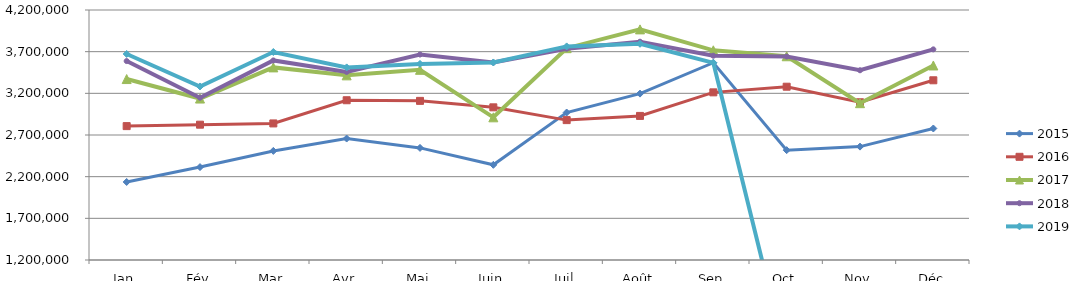
| Category | 2015 | 2016 | 2017 | 2018 | 2019 |
|---|---|---|---|---|---|
| Jan | 2136502.342 | 2806589.776 | 3371394.712 | 3587233.956 | 3672518.421 |
| Fév | 2315053.514 | 2823756.288 | 3137330.791 | 3147030.186 | 3282543.846 |
| Mar | 2509043.11 | 2838870.504 | 3511145.885 | 3594630.489 | 3695934.705 |
| Avr | 2657589.53 | 3117177.085 | 3415732.63 | 3456756.804 | 3511049.816 |
| Mai | 2545128.164 | 3109551.865 | 3482213.067 | 3665518.998 | 3553093.664 |
| Juin | 2342028.041 | 3032032.74 | 2912135.998 | 3570082.41 | 3570224.807 |
| Juil | 2969663.081 | 2878621.442 | 3741770.069 | 3735197.664 | 3762976.089 |
| Août | 3196553.523 | 2928941.165 | 3967466.719 | 3819459.479 | 3794659.092 |
| Sep | 3567173.843 | 3211689.699 | 3716298.608 | 3651284.946 | 3566098.404 |
| Oct | 2518251.995 | 3279542.566 | 3644824.355 | 3642052.865 | 0 |
| Nov | 2560629.68 | 3092952.422 | 3081786.206 | 3476734.023 | 0 |
| Déc | 2778132.919 | 3356598.391 | 3534249.207 | 3727602.186 | 0 |